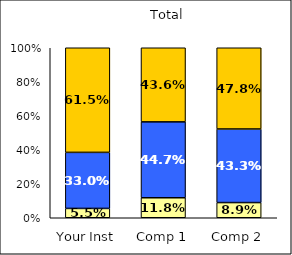
| Category | Low Faculty Interaction | Average Faculty Interaction | High Faculty Interaction |
|---|---|---|---|
| Your Inst | 0.055 | 0.33 | 0.615 |
| Comp 1 | 0.118 | 0.447 | 0.436 |
| Comp 2 | 0.089 | 0.433 | 0.478 |